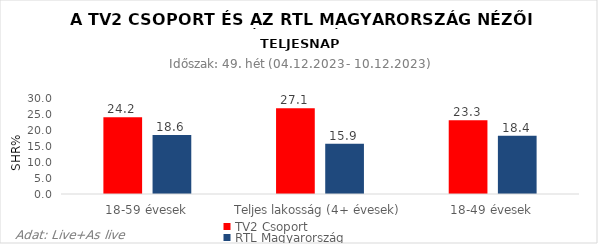
| Category | TV2 Csoport | RTL Magyarország |
|---|---|---|
| 18-59 évesek | 24.2 | 18.6 |
| Teljes lakosság (4+ évesek) | 27.1 | 15.9 |
| 18-49 évesek | 23.3 | 18.4 |